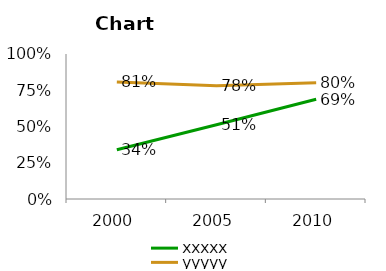
| Category | xxxxx | yyyyy |
|---|---|---|
| 2000.0 | 0.34 | 0.807 |
| 2005.0 | 0.512 | 0.781 |
| 2010.0 | 0.688 | 0.801 |